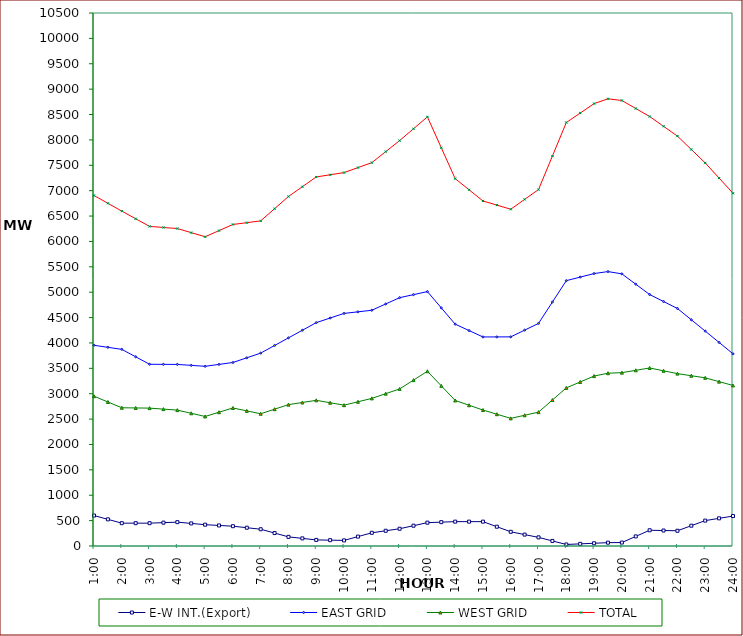
| Category | E-W INT.(Export) | EAST GRID | WEST GRID | TOTAL |
|---|---|---|---|---|
| 1:00 | 600 | 3954 | 2951 | 6905 |
| 1:30 | 525 | 3914 | 2837 | 6751 |
| 2:00 | 450 | 3874 | 2723 | 6597 |
| 2:30 | 450 | 3727 | 2719.5 | 6446.5 |
| 3:00 | 450 | 3580 | 2716 | 6296 |
| 3:30 | 460 | 3578.5 | 2696.5 | 6275 |
| 4:00 | 470 | 3577 | 2677 | 6254 |
| 4:30 | 445 | 3558.5 | 2614.5 | 6173 |
| 5:00 | 420 | 3540 | 2552 | 6092 |
| 5:30 | 405 | 3577.5 | 2635.5 | 6213 |
| 6:00 | 390 | 3615 | 2719 | 6334 |
| 6:30 | 360 | 3707.5 | 2662 | 6369.5 |
| 7:00 | 330 | 3800 | 2605 | 6405 |
| 7:30 | 255 | 3950 | 2695 | 6645 |
| 8:00 | 180 | 4100 | 2785 | 6885 |
| 8:30 | 150 | 4250 | 2827.5 | 7077.5 |
| 9:00 | 120 | 4400 | 2870 | 7270 |
| 9:30 | 115 | 4491 | 2822 | 7313 |
| 10:00 | 110 | 4582 | 2774 | 7356 |
| 10:30 | 185 | 4613 | 2841 | 7454 |
| 11:00 | 260 | 4644 | 2908 | 7552 |
| 11:30 | 300 | 4768 | 3001 | 7769 |
| 12:00 | 340 | 4892 | 3094 | 7986 |
| 12:30 | 400 | 4952 | 3268 | 8220 |
| 13:00 | 460 | 5012 | 3442 | 8454 |
| 13:30 | 470 | 4691 | 3154.5 | 7845.5 |
| 14:00 | 480 | 4370 | 2867 | 7237 |
| 14:30 | 480 | 4244 | 2773 | 7017 |
| 15:00 | 480 | 4118 | 2679 | 6797 |
| 15:30 | 380 | 4119 | 2596.5 | 6715.5 |
| 16:00 | 280 | 4120 | 2514 | 6634 |
| 16:30 | 225 | 4252.5 | 2575.5 | 6828 |
| 17:00 | 170 | 4385 | 2637 | 7022 |
| 17:30 | 100 | 4806 | 2876 | 7682 |
| 18:00 | 30 | 5227 | 3115 | 8342 |
| 18:30 | 42 | 5297 | 3231.5 | 8528.5 |
| 19:00 | 54 | 5367 | 3348 | 8715 |
| 19:30 | 66 | 5406 | 3404 | 8810 |
| 20:00 | 68 | 5361 | 3415 | 8776 |
| 20:30 | 189 | 5157.5 | 3461 | 8618.5 |
| 21:00 | 310 | 4954 | 3507 | 8461 |
| 21:30 | 305 | 4816.5 | 3451.5 | 8268 |
| 22:00 | 300 | 4679 | 3396 | 8075 |
| 22:30 | 400 | 4456.5 | 3354.5 | 7811 |
| 23:00 | 500 | 4234 | 3313 | 7547 |
| 23:30 | 545 | 4010 | 3238 | 7248 |
| 24:00 | 590 | 3786 | 3163 | 6949 |